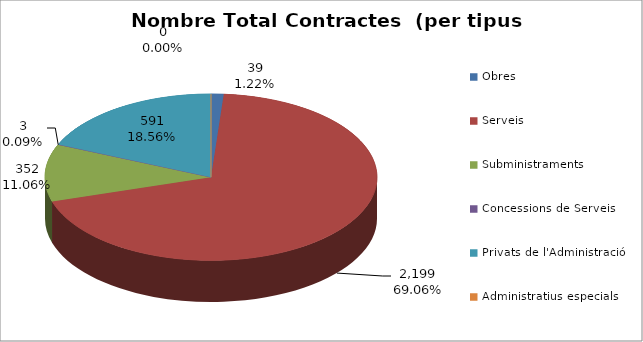
| Category | Nombre Total Contractes |
|---|---|
| Obres | 39 |
| Serveis | 2199 |
| Subministraments | 352 |
| Concessions de Serveis | 3 |
| Privats de l'Administració | 591 |
| Administratius especials | 0 |